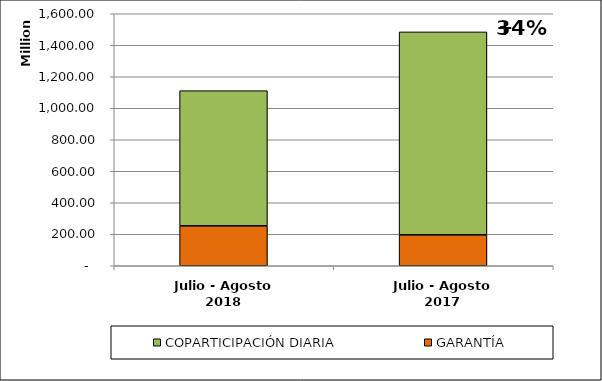
| Category | GARANTÍA | COPARTICIPACIÓN DIARIA |
|---|---|---|
| Julio - Agosto 2018 | 253540012.72 | 858264571 |
| Julio - Agosto 2017 | 196339859.41 | 1288418992.88 |